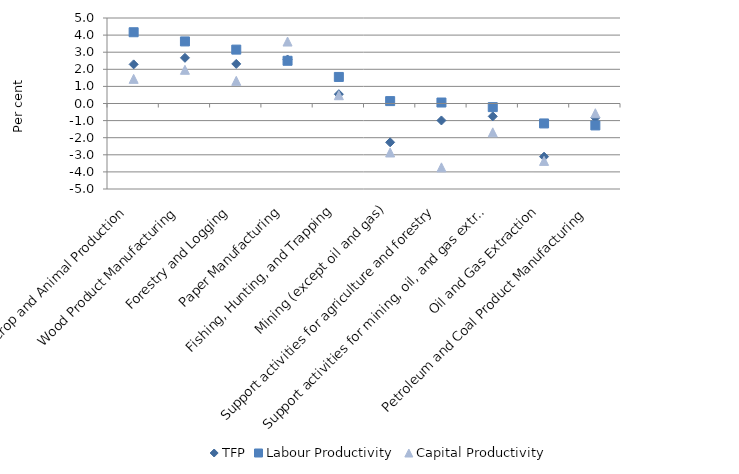
| Category | TFP | Labour Productivity | Capital Productivity |
|---|---|---|---|
| Crop and Animal Production | 2.288 | 4.167 | 1.441 |
| Wood Product Manufacturing | 2.671 | 3.63 | 1.972 |
| Forestry and Logging | 2.315 | 3.151 | 1.324 |
| Paper Manufacturing | 2.575 | 2.497 | 3.623 |
| Fishing, Hunting, and Trapping | 0.546 | 1.553 | 0.484 |
| Mining (except oil and gas) | -2.27 | 0.14 | -2.864 |
| Support activities for agriculture and forestry | -0.992 | 0.057 | -3.734 |
| Support activities for mining, oil, and gas extraction | -0.754 | -0.212 | -1.686 |
| Oil and Gas Extraction | -3.11 | -1.166 | -3.356 |
| Petroleum and Coal Product Manufacturing | -0.836 | -1.282 | -0.57 |